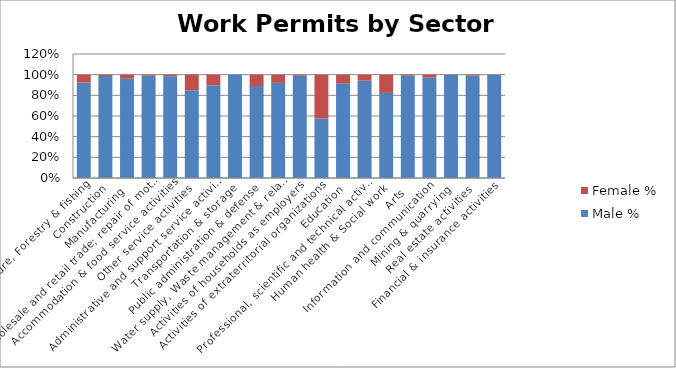
| Category | Male % | Female % |
|---|---|---|
| Agriculture, Forestry & fishing | 0.923 | 0.077 |
| Construction | 0.987 | 0.013 |
| Manufacturing | 0.961 | 0.039 |
| Wholesale and retail trade; repair of motor vehicles  | 0.99 | 0.01 |
| Accommodation & food service activities | 0.985 | 0.015 |
| Other service activities | 0.849 | 0.151 |
| Administrative and support service activities | 0.898 | 0.102 |
| Transportation & storage | 0.999 | 0.001 |
| Public administration & defense | 0.89 | 0.11 |
| Water supply, Waste management & related activities | 0.921 | 0.079 |
| Activities of households as employers | 0.991 | 0.009 |
| Activities of extraterritorial organizations  | 0.575 | 0.425 |
| Education | 0.917 | 0.083 |
| Professional, scientific and technical activities | 0.943 | 0.057 |
| Human health & Social work | 0.824 | 0.176 |
| Arts | 0.991 | 0.009 |
| Information and communication | 0.972 | 0.028 |
| Mining & quarrying | 1 | 0 |
| Real estate activities | 0.991 | 0.009 |
| Financial & insurance activities | 1 | 0 |